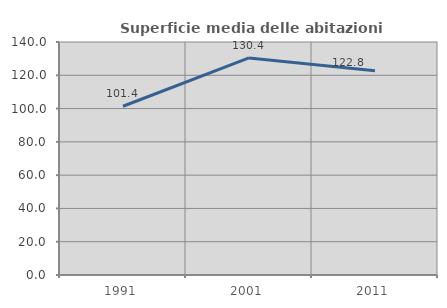
| Category | Superficie media delle abitazioni occupate |
|---|---|
| 1991.0 | 101.397 |
| 2001.0 | 130.422 |
| 2011.0 | 122.75 |